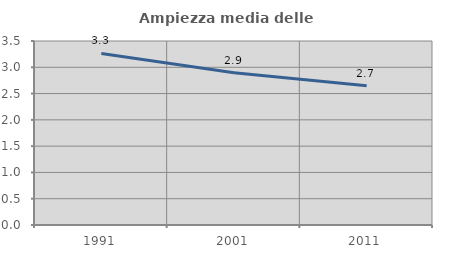
| Category | Ampiezza media delle famiglie |
|---|---|
| 1991.0 | 3.263 |
| 2001.0 | 2.894 |
| 2011.0 | 2.651 |